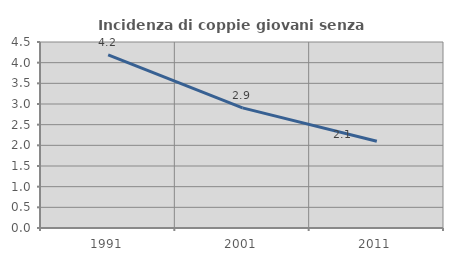
| Category | Incidenza di coppie giovani senza figli |
|---|---|
| 1991.0 | 4.187 |
| 2001.0 | 2.906 |
| 2011.0 | 2.1 |